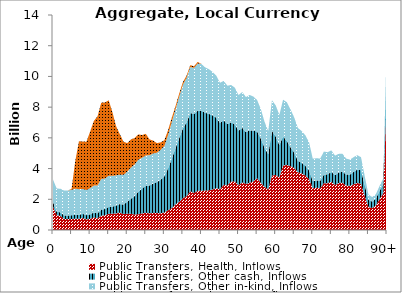
| Category | Public Transfers, Health, Inflows | Public Transfers, Other cash, Inflows | Public Transfers, Other in-kind, Inflows | Public Transfers, Education, Inflows |
|---|---|---|---|---|
| 0 | 1529.656 | 286.037 | 1468.433 | 0 |
|  | 965.554 | 232.412 | 1502.514 | 0 |
| 2 | 914.369 | 231.31 | 1540.74 | 0 |
| 3 | 724.687 | 228.287 | 1610.997 | 0 |
| 4 | 710.836 | 236.051 | 1618.731 | 0 |
| 5 | 714.326 | 245.885 | 1652.436 | 64.919 |
| 6 | 731.986 | 257.526 | 1702.595 | 1800.454 |
| 7 | 723.374 | 264.585 | 1670.753 | 3123.145 |
| 8 | 779.141 | 273.23 | 1617.707 | 3090.203 |
| 9 | 694.317 | 272.555 | 1638.079 | 3146.211 |
| 10 | 726.585 | 288.809 | 1705.349 | 3677.471 |
| 11 | 826.576 | 315.111 | 1749.277 | 4209.902 |
| 12 | 754.622 | 325.735 | 1818.723 | 4504.596 |
| 13 | 932.76 | 392.616 | 2002.121 | 4964.266 |
| 14 | 959.98 | 408.8 | 1981.85 | 4950.759 |
| 15 | 1048.368 | 448.6 | 2039.823 | 4911.562 |
| 16 | 1060.007 | 463.352 | 2000.859 | 4164.674 |
| 17 | 1080.427 | 506.001 | 1972.179 | 3201.554 |
| 18 | 1131.92 | 555.949 | 1915.813 | 2637.205 |
| 19 | 1033.342 | 626.801 | 1928.53 | 2162.707 |
| 20 | 1063.19 | 771.611 | 1965.816 | 1856.573 |
| 21 | 1056.746 | 971.865 | 2037.983 | 1837.885 |
| 22 | 1010.281 | 1203.778 | 2051.6 | 1722.762 |
| 23 | 1026.123 | 1467.83 | 2086.538 | 1644.32 |
| 24 | 1077.831 | 1624.672 | 2000.589 | 1482.748 |
| 25 | 1122.56 | 1744.316 | 1987.458 | 1412.746 |
| 26 | 1085.891 | 1807.395 | 1978.065 | 1033.804 |
| 27 | 1112.751 | 1917.86 | 1955.78 | 832.161 |
| 28 | 1114.537 | 2006.547 | 1911.714 | 626.397 |
| 29 | 1088.304 | 2183.087 | 1944.641 | 492.498 |
| 30 | 1141.161 | 2354.456 | 1973.638 | 378.831 |
| 31 | 1285.721 | 2723.491 | 2168.655 | 317.177 |
| 32 | 1425.879 | 3205.734 | 2399.579 | 272.361 |
| 33 | 1670.356 | 3652.947 | 2514.158 | 222.731 |
| 34 | 1835.145 | 4140.794 | 2702.262 | 198.133 |
| 35 | 2070.088 | 4550.983 | 2834.395 | 172.272 |
| 36 | 2205.406 | 4800.61 | 2906.683 | 147.009 |
| 37 | 2524.086 | 5096.988 | 2989.973 | 125.311 |
| 38 | 2408.41 | 5138.577 | 3010.817 | 106.674 |
| 39 | 2551.936 | 5224.686 | 3064.982 | 106.674 |
| 40 | 2551.017 | 5206.68 | 3047.991 | 0 |
| 41 | 2569.971 | 5064.274 | 2956.763 | 0 |
| 42 | 2583.606 | 4978.309 | 2913.274 | 0 |
| 43 | 2643.526 | 4816.432 | 2836.559 | 0 |
| 44 | 2722.087 | 4585.085 | 2747.713 | 0 |
| 45 | 2654.886 | 4318.959 | 2610.842 | 0 |
| 46 | 2945.026 | 4205.625 | 2560.927 | 0 |
| 47 | 2907.924 | 3988.337 | 2500.333 | 0 |
| 48 | 3159.883 | 3853.401 | 2430.797 | 0 |
| 49 | 3154.152 | 3717.157 | 2394.898 | 0 |
| 50 | 2916.964 | 3550.785 | 2323.451 | 0 |
| 51 | 3096.554 | 3555.417 | 2331.77 | 0 |
| 52 | 2997.244 | 3373.16 | 2287.834 | 0 |
| 53 | 3078.646 | 3410.705 | 2304.713 | 0 |
| 54 | 3167.157 | 3292.442 | 2227.513 | 0 |
| 55 | 3370.788 | 3043.747 | 2050.079 | 0 |
| 56 | 3075.992 | 2870.484 | 1932.953 | 0 |
| 57 | 2807.55 | 2546.361 | 1696.563 | 0 |
| 58 | 2648.006 | 2285.606 | 1504.532 | 0 |
| 59 | 3545.586 | 2906.617 | 1997.382 | 0 |
| 60 | 3587.765 | 2501.048 | 2030.754 | 0 |
| 61 | 3420.687 | 2108.916 | 1977.323 | 0 |
| 62 | 4204.751 | 1886.271 | 2390.464 | 0 |
| 63 | 4236.359 | 1568.932 | 2518.816 | 0 |
| 64 | 4157.305 | 1232.958 | 2466.065 | 0 |
| 65 | 4037.949 | 995.727 | 2296.284 | 0 |
| 66 | 3758.413 | 745.181 | 2136.917 | 0 |
| 67 | 3688.639 | 691.412 | 2068.975 | 0 |
| 68 | 3547.391 | 635.275 | 1983.426 | 0 |
| 69 | 3309.594 | 573.674 | 1829.205 | 0 |
| 70 | 2718.123 | 464.559 | 1462.071 | 0 |
| 71 | 2755.586 | 474.585 | 1441.866 | 0 |
| 72 | 2720.354 | 483.049 | 1450.418 | 0 |
| 73 | 3045.095 | 555.422 | 1507.47 | 0 |
| 74 | 3043.681 | 586.561 | 1437.185 | 0 |
| 75 | 3139.387 | 644.848 | 1399.841 | 0 |
| 76 | 2932.676 | 640.3 | 1274.536 | 0 |
| 77 | 3057.966 | 686.367 | 1218.466 | 0 |
| 78 | 3079.565 | 717.305 | 1167.966 | 0 |
| 79 | 2897.742 | 709.712 | 1045.727 | 0 |
| 80 | 2867.852 | 739.107 | 976.457 | 0 |
| 81 | 2980.099 | 802.331 | 960.572 | 0 |
| 82 | 3063.318 | 873.19 | 936.733 | 0 |
| 83 | 2993.459 | 898.475 | 848.466 | 0 |
| 84 | 2216.981 | 700.57 | 587.715 | 0 |
| 85 | 1498.687 | 470.779 | 345.898 | 0 |
| 86 | 1433.208 | 414.984 | 296.425 | 0 |
| 87 | 1590.683 | 453.223 | 289.817 | 0 |
| 88 | 2020.689 | 524.898 | 325.265 | 0 |
| 89 | 2386.671 | 614.649 | 356.979 | 0 |
| 90+ | 9220.18 | 2341.567 | 1243.482 | 0 |